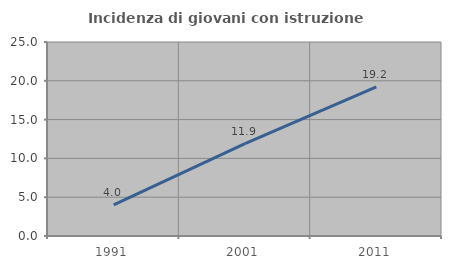
| Category | Incidenza di giovani con istruzione universitaria |
|---|---|
| 1991.0 | 4 |
| 2001.0 | 11.905 |
| 2011.0 | 19.231 |